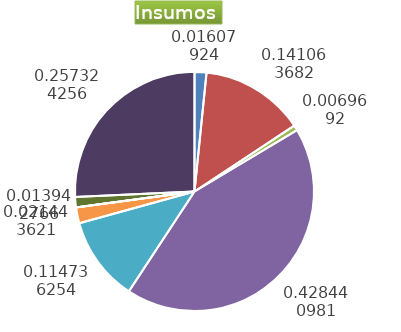
| Category | Series 0 |
|---|---|
| Control arvenses | 99472 |
| Control fitosanitario | 872671 |
| Cosecha y beneficio | 43113.996 |
| Fertilización | 2650491 |
| Instalación | 709800 |
| Otros | 132658 |
| Podas | 0 |
| Riego | 0 |
| Transporte | 86255 |
| Tutorado | 1591901 |